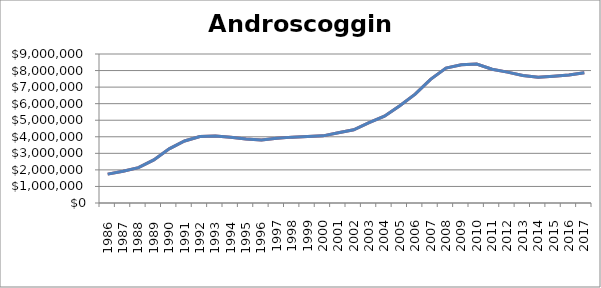
| Category | Series 1 | Androscoggin |
|---|---|---|
|       1986 | 1743650 | 1743650 |
|       1987 | 1920600 | 1920600 |
|       1988 | 2133350 | 2133350 |
|       1989 | 2604950 | 2604950 |
|       1990 | 3267750 | 3267750 |
|       1991 | 3745250 | 3745250 |
|       1992 | 4014250 | 4014250 |
|       1993 | 4051550 | 4051550 |
|       1994 | 3971050 | 3971050 |
|       1995 | 3871400 | 3871400 |
|       1996 | 3807550 | 3807550 |
| 1997 | 3908400 | 3908400 |
| 1998 | 3978850 | 3978850 |
| 1999 | 4014450 | 4014450 |
| 2000 | 4056300 | 4056300 |
| 2001 | 4243950 | 4243950 |
| 2002 | 4421050 | 4421050 |
| 2003 | 4853700 | 4853700 |
| 2004 | 5245650 | 5245650 |
| 2005 | 5879200 | 5879200 |
| 2006 | 6574800 | 6574800 |
| 2007 | 7465650 | 7465650 |
| 2008 | 8152900 | 8152900 |
| 2009 | 8355250 | 8355250 |
| 2010 | 8396850 | 8396850 |
| 2011 | 8083500 | 8083500 |
| 2012 | 7904150 | 7904150 |
| 2013 | 7697100 | 7697100 |
| 2014 | 7595950 | 7595950 |
| 2015 | 7661900 | 7661900 |
| 2016 | 7737850 | 7737850 |
| 2017 | 7870050 | 7870050 |